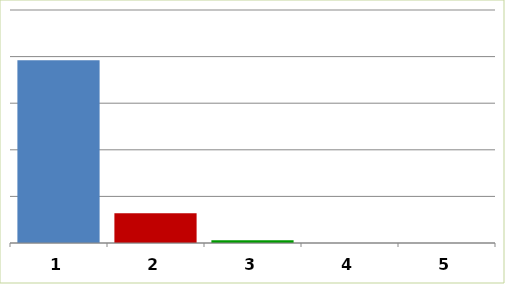
| Category | Series 0 |
|---|---|
| 0 | 1960892944.94 |
| 1 | 318756120.06 |
| 2 | 30465000 |
| 3 | 0 |
| 4 | 0 |